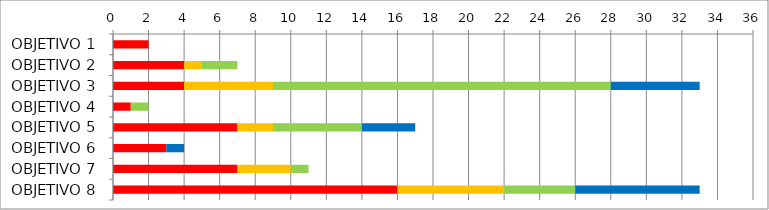
| Category | Series 1 | Series 2 | Series 3 | Series 4 | Series 5 |
|---|---|---|---|---|---|
| OBJETIVO 1 | 0 | 2 | 0 | 0 | 0 |
| OBJETIVO 2 | 0 | 4 | 1 | 2 | 0 |
| OBJETIVO 3 | 0 | 4 | 5 | 19 | 5 |
| OBJETIVO 4 | 0 | 1 | 0 | 1 | 0 |
| OBJETIVO 5 | 0 | 7 | 2 | 5 | 3 |
| OBJETIVO 6 | 0 | 3 | 0 | 0 | 1 |
| OBJETIVO 7 | 0 | 7 | 3 | 1 | 0 |
| OBJETIVO 8 | 0 | 16 | 6 | 4 | 7 |